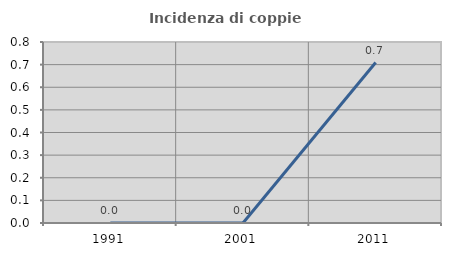
| Category | Incidenza di coppie miste |
|---|---|
| 1991.0 | 0 |
| 2001.0 | 0 |
| 2011.0 | 0.709 |